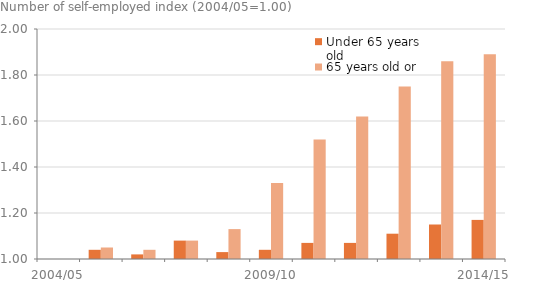
| Category | Under 65 years old | 65 years old or over |
|---|---|---|
| 2004/05 | 1 | 1 |
| 2005/06 | 1.04 | 1.05 |
| 2006/07 | 1.02 | 1.04 |
| 2007/08 | 1.08 | 1.08 |
| 2008/09 | 1.03 | 1.13 |
| 2009/10 | 1.04 | 1.33 |
| 2010/11 | 1.07 | 1.52 |
| 2011/12 | 1.07 | 1.62 |
| 2012/13 | 1.11 | 1.75 |
| 2013/14 | 1.15 | 1.86 |
| 2014/15 | 1.17 | 1.89 |